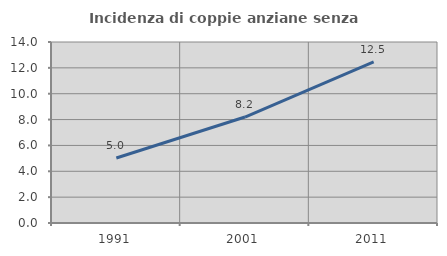
| Category | Incidenza di coppie anziane senza figli  |
|---|---|
| 1991.0 | 5.03 |
| 2001.0 | 8.197 |
| 2011.0 | 12.454 |